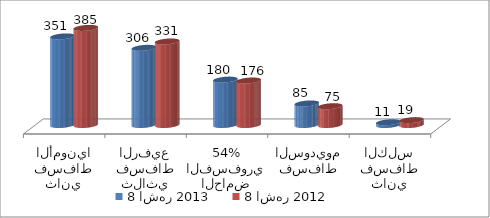
| Category | 8 اشهر 2013 | 8 اشهر 2012 |
|---|---|---|
| ثاني فسفاط الأمونيا | 351.073 | 384.778 |
| ثلاثي فسفاط الرفيع | 305.74 | 330.995 |
| الحامض الفسفوري 54% | 179.828 | 176.268 |
| فسفاط السوديوم | 85.285 | 74.521 |
| ثاني فسفاط الكلس | 10.8 | 19.3 |